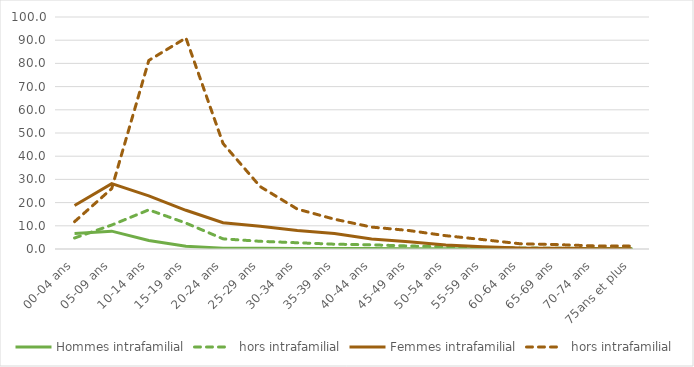
| Category | Hommes | Femmes |
|---|---|---|
| 00-04 ans | 4.737 | 11.784 |
| 05-09 ans | 10.328 | 26.022 |
| 10-14 ans | 16.879 | 81.283 |
| 15-19 ans | 11.173 | 90.98 |
| 20-24 ans | 4.379 | 45.462 |
| 25-29 ans | 3.317 | 26.894 |
| 30-34 ans | 2.694 | 17.219 |
| 35-39 ans | 2.069 | 12.841 |
| 40-44 ans | 1.788 | 9.451 |
| 45-49 ans | 1.295 | 7.978 |
| 50-54 ans | 0.997 | 5.736 |
| 55-59 ans | 0.676 | 4.045 |
| 60-64 ans | 0.438 | 2.258 |
| 65-69 ans | 0.345 | 1.899 |
| 70-74 ans | 0.223 | 1.329 |
| 75ans et plus | 0.15 | 1.262 |